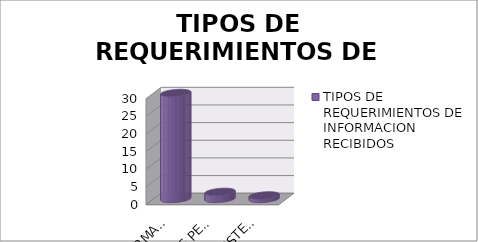
| Category | TIPOS DE REQUERIMIENTOS DE INFORMACION RECIBIDOS |
|---|---|
| INFORMACION PUBLICA  | 30 |
| DATOS PERSONALES  | 2 |
| INEXISTENTE  | 1 |